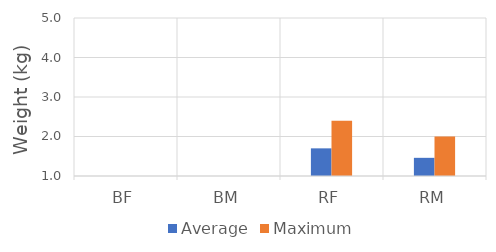
| Category | Average | Maximum |
|---|---|---|
| BF | 0 | 0 |
| BM | 0 | 0 |
| RF | 1.7 | 2.4 |
| RM | 1.46 | 2 |